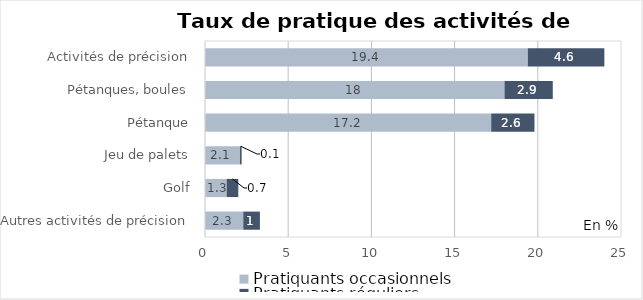
| Category | Pratiquants occasionnels | Pratiquants réguliers |
|---|---|---|
| Autres activités de précision | 2.3 | 1 |
| Golf | 1.3 | 0.7 |
| Jeu de palets | 2.1 | 0.1 |
| Pétanque | 17.2 | 2.6 |
| Pétanques, boules | 18 | 2.9 |
| Activités de précision | 19.4 | 4.6 |